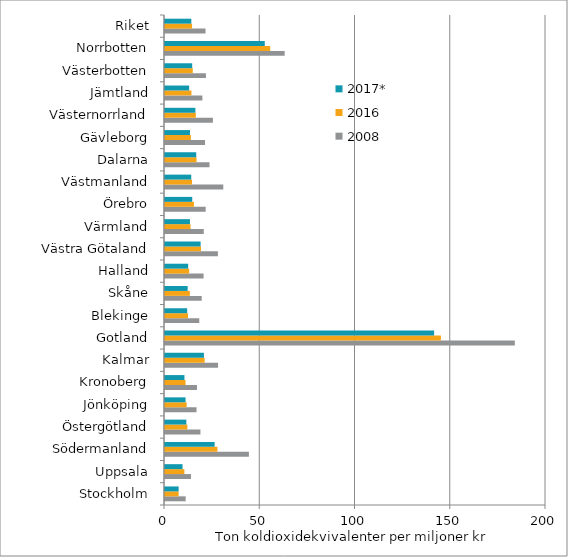
| Category | 2008 | 2016 | 2017* |
|---|---|---|---|
| Stockholm | 10.85 | 7.158 | 7.15 |
| Uppsala | 13.618 | 10.173 | 9.197 |
| Södermanland | 44.04 | 27.53 | 26.046 |
| Östergötland | 18.607 | 11.753 | 11.201 |
| Jönköping | 16.544 | 11.362 | 10.786 |
| Kronoberg | 16.785 | 10.79 | 10.207 |
| Kalmar | 27.851 | 20.808 | 20.43 |
| Gotland | 183.625 | 144.832 | 141.278 |
| Blekinge | 17.996 | 12.08 | 11.637 |
| Skåne | 19.26 | 13.057 | 11.893 |
| Halland | 20.249 | 12.679 | 12.15 |
| Västra Götaland | 27.776 | 18.918 | 18.699 |
| Värmland | 20.35 | 13.41 | 13.096 |
| Örebro | 21.354 | 15.188 | 14.307 |
| Västmanland | 30.598 | 14.2 | 13.769 |
| Dalarna | 23.366 | 16.57 | 16.391 |
| Gävleborg | 21.018 | 13.586 | 13.111 |
| Västernorrland | 25.147 | 16.183 | 15.944 |
| Jämtland | 19.616 | 13.873 | 12.683 |
| Västerbotten | 21.489 | 14.588 | 14.274 |
| Norrbotten | 62.823 | 55.229 | 52.376 |
| Riket | 21.271 | 14.208 | 13.818 |